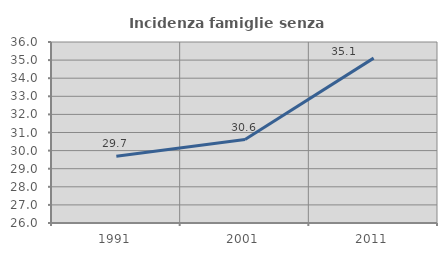
| Category | Incidenza famiglie senza nuclei |
|---|---|
| 1991.0 | 29.682 |
| 2001.0 | 30.611 |
| 2011.0 | 35.108 |